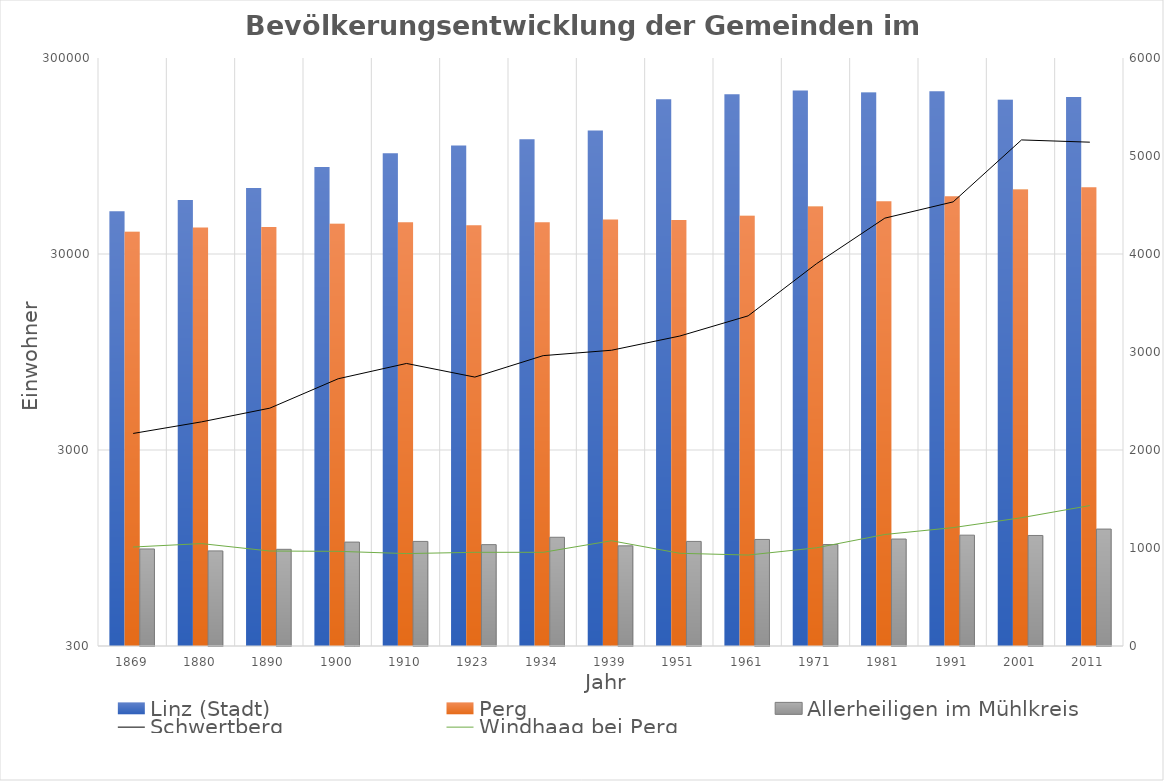
| Category | Linz (Stadt) | Perg | Allerheiligen im Mühlkreis |
|---|---|---|---|
| 1869.0 | 49635 | 38911 | 938 |
| 1880.0 | 56569 | 40993 | 917 |
| 1890.0 | 65090 | 41172 | 934 |
| 1900.0 | 83356 | 42799 | 1017 |
| 1910.0 | 97852 | 43523 | 1025 |
| 1923.0 | 107463 | 42014 | 987 |
| 1934.0 | 115338 | 43618 | 1076 |
| 1939.0 | 128177 | 45013 | 973 |
| 1951.0 | 184685 | 44707 | 1025 |
| 1961.0 | 195978 | 46980 | 1049 |
| 1971.0 | 204889 | 52414 | 988 |
| 1981.0 | 199910 | 55808 | 1054 |
| 1991.0 | 203044 | 59056 | 1103 |
| 2001.0 | 183504 | 63955 | 1099 |
| 2011.0 | 189889 | 65738 | 1185 |